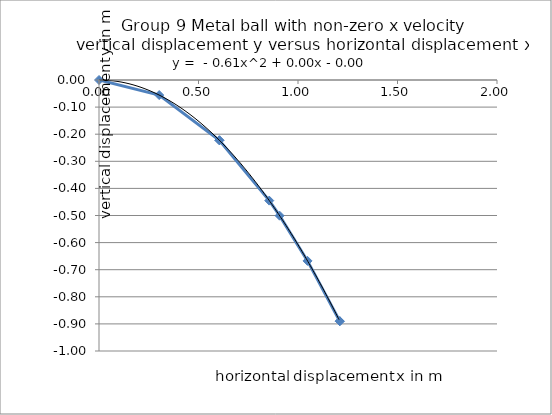
| Category | Series 0 |
|---|---|
| 0.0 | 0 |
| 0.3025 | -0.056 |
| 0.605 | -0.222 |
| 0.605 | -0.222 |
| 0.8555992052357225 | -0.445 |
| 0.9075 | -0.501 |
| 1.0478907385791707 | -0.668 |
| 1.21 | -0.89 |
| 1.21 | -0.89 |